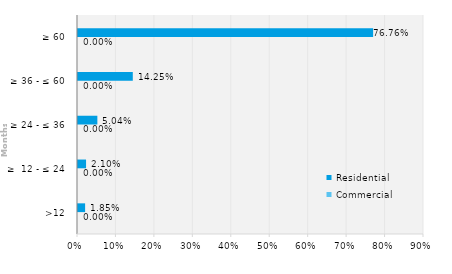
| Category | Commercial | Residential |
|---|---|---|
| >12 | 0 | 0.018 |
| ≥  12 - ≤ 24 | 0 | 0.021 |
| ≥ 24 - ≤ 36 | 0 | 0.05 |
| ≥ 36 - ≤ 60 | 0 | 0.143 |
| ≥ 60 | 0 | 0.768 |